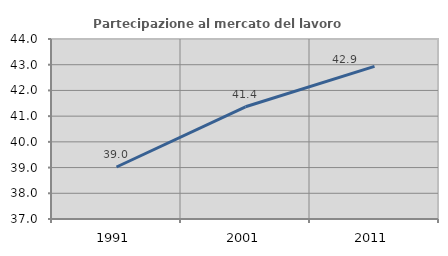
| Category | Partecipazione al mercato del lavoro  femminile |
|---|---|
| 1991.0 | 39.023 |
| 2001.0 | 41.364 |
| 2011.0 | 42.933 |